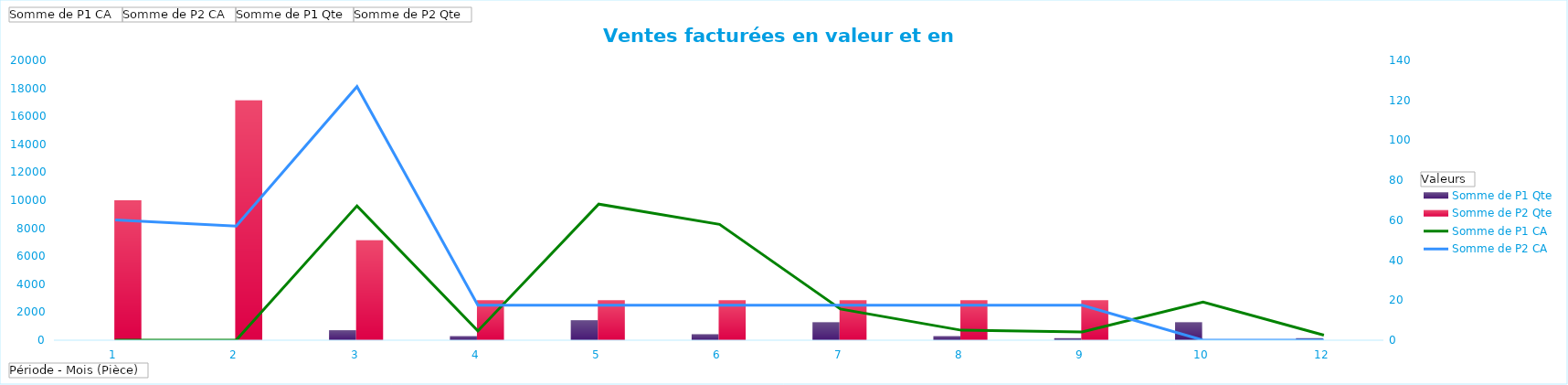
| Category | Somme de P1 Qte | Somme de P2 Qte |
|---|---|---|
| 1 | 0 | 70 |
| 2 | 0 | 120 |
| 3 | 5 | 50 |
| 4 | 2 | 20 |
| 5 | 10 | 20 |
| 6 | 3 | 20 |
| 7 | 9 | 20 |
| 8 | 2 | 20 |
| 9 | 1 | 20 |
| 10 | 9 | 0 |
| 12 | 1 | 0 |